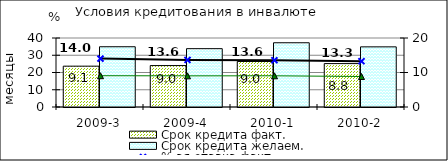
| Category | Срок кредита факт.  | Срок кредита желаем. |
|---|---|---|
| 2009-3 | 23.67 | 34.93 |
| 2009-4 | 24.02 | 33.82 |
| 2010-1 | 26.39 | 37.24 |
| 2010-2 | 25.16 | 34.87 |